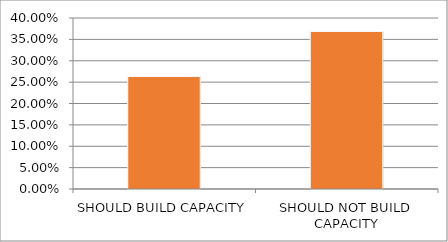
| Category | Series 0 |
|---|---|
| SHOULD BUILD CAPACITY | 0.263 |
| SHOULD NOT BUILD CAPACITY | 0.368 |